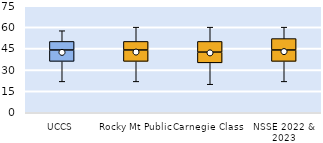
| Category | 25th | 50th | 75th |
|---|---|---|---|
| UCCS | 36 | 8 | 6 |
| Rocky Mt Public | 36 | 8 | 6 |
| Carnegie Class | 35 | 7.5 | 7.5 |
| NSSE 2022 & 2023 | 36 | 8 | 8 |